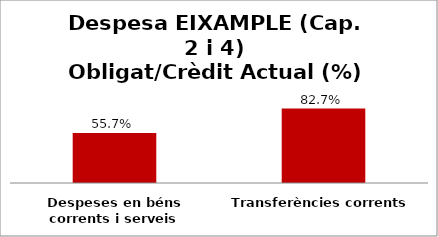
| Category | Series 0 |
|---|---|
| Despeses en béns corrents i serveis | 0.557 |
| Transferències corrents | 0.827 |